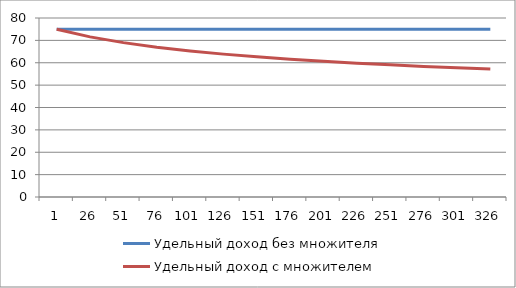
| Category | Удельный доход без множителя  | Удельный доход с множителем |
|---|---|---|
| 1.0 | 75 | 75 |
| 26.0 | 75 | 71.57 |
| 51.0 | 75 | 68.988 |
| 76.0 | 75 | 66.944 |
| 101.0 | 75 | 65.268 |
| 126.0 | 75 | 63.856 |
| 151.0 | 75 | 62.644 |
| 176.0 | 75 | 61.585 |
| 201.0 | 75 | 60.65 |
| 226.0 | 75 | 59.813 |
| 251.0 | 75 | 59.059 |
| 276.0 | 75 | 58.374 |
| 301.0 | 75 | 57.747 |
| 326.0 | 75 | 57.17 |